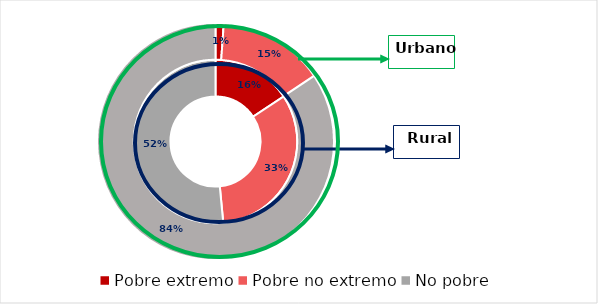
| Category | Rural | Urbano |
|---|---|---|
| Pobre extremo | 0.157 | 0.011 |
| Pobre no extremo | 0.328 | 0.145 |
| No pobre | 0.515 | 0.843 |